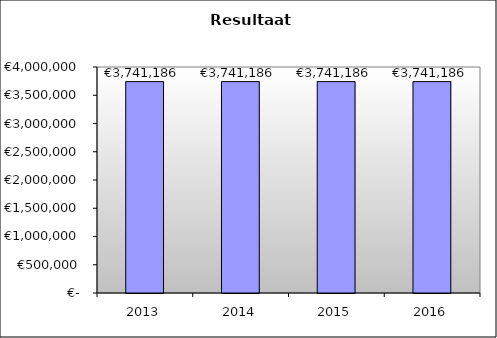
| Category | Series 0 |
|---|---|
| 2013.0 | 3741185.76 |
| 2014.0 | 3741185.76 |
| 2015.0 | 3741185.76 |
| 2016.0 | 3741185.76 |